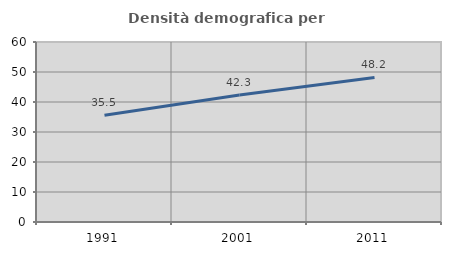
| Category | Densità demografica |
|---|---|
| 1991.0 | 35.549 |
| 2001.0 | 42.344 |
| 2011.0 | 48.185 |